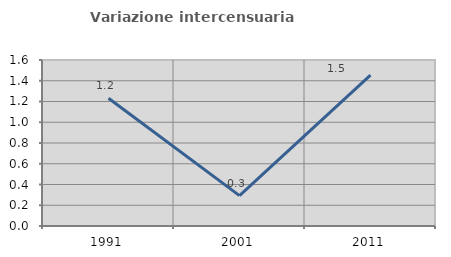
| Category | Variazione intercensuaria annua |
|---|---|
| 1991.0 | 1.231 |
| 2001.0 | 0.292 |
| 2011.0 | 1.455 |